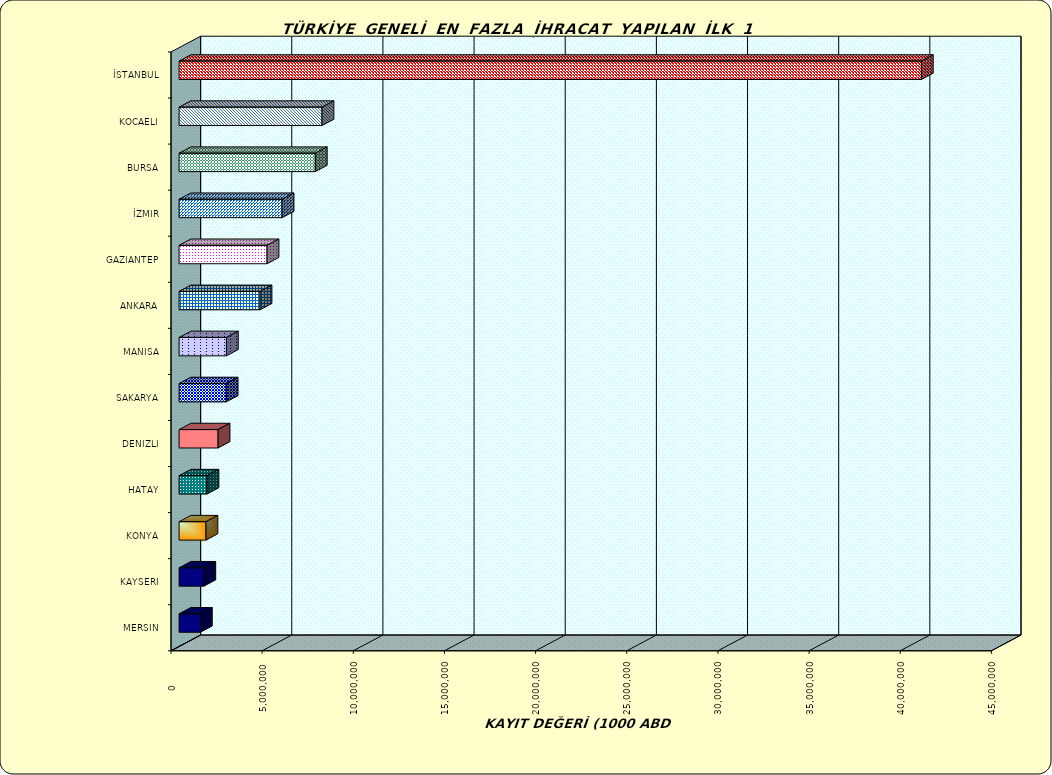
| Category | Series 0 |
|---|---|
| İSTANBUL | 40715379.848 |
| KOCAELI | 7840382.923 |
| BURSA | 7473073.812 |
| İZMIR | 5651308.367 |
| GAZIANTEP | 4825290.802 |
| ANKARA | 4441806.066 |
| MANISA | 2597220.604 |
| SAKARYA | 2583958.467 |
| DENIZLI | 2138604.554 |
| HATAY | 1531571.327 |
| KONYA | 1475018.724 |
| KAYSERI | 1358858.418 |
| MERSIN | 1169636.675 |